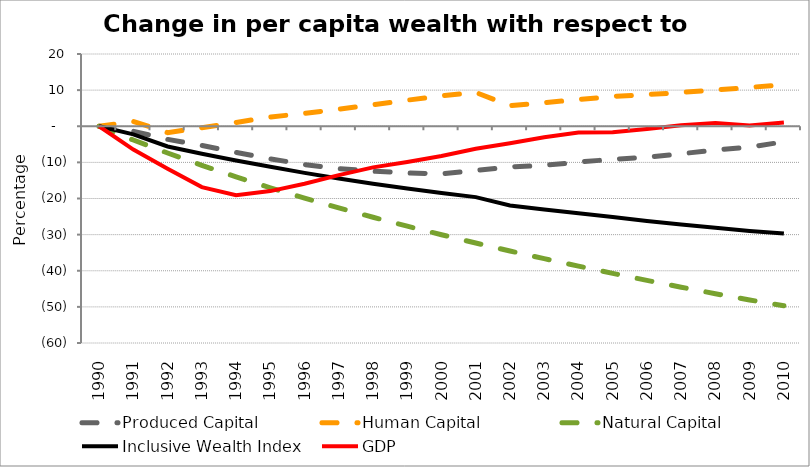
| Category | Produced Capital  | Human Capital | Natural Capital | Inclusive Wealth Index | GDP |
|---|---|---|---|---|---|
| 1990.0 | 0 | 0 | 0 | 0 | 0 |
| 1991.0 | -1.384 | 1.326 | -3.812 | -2.251 | -6.445 |
| 1992.0 | -3.631 | -1.762 | -7.41 | -5.599 | -11.781 |
| 1993.0 | -5.324 | -0.395 | -10.813 | -7.6 | -16.853 |
| 1994.0 | -7.245 | 1.049 | -14.009 | -9.465 | -19.112 |
| 1995.0 | -9.015 | 2.553 | -17.032 | -11.188 | -17.949 |
| 1996.0 | -10.597 | 3.572 | -19.884 | -12.911 | -15.911 |
| 1997.0 | -11.725 | 4.719 | -22.604 | -14.477 | -13.527 |
| 1998.0 | -12.444 | 5.97 | -25.195 | -15.896 | -11.379 |
| 1999.0 | -12.935 | 7.219 | -27.663 | -17.216 | -9.873 |
| 2000.0 | -13.175 | 8.397 | -30.034 | -18.469 | -8.232 |
| 2001.0 | -12.241 | 9.373 | -32.318 | -19.62 | -6.251 |
| 2002.0 | -11.253 | 5.667 | -34.523 | -21.948 | -4.682 |
| 2003.0 | -10.828 | 6.519 | -36.653 | -23.075 | -3.057 |
| 2004.0 | -9.913 | 7.386 | -38.714 | -24.111 | -1.705 |
| 2005.0 | -9.154 | 8.257 | -40.721 | -25.123 | -1.671 |
| 2006.0 | -8.554 | 8.751 | -42.671 | -26.212 | -0.734 |
| 2007.0 | -7.61 | 9.363 | -44.555 | -27.197 | 0.254 |
| 2008.0 | -6.595 | 10.045 | -46.359 | -28.106 | 0.898 |
| 2009.0 | -5.778 | 10.759 | -48.085 | -28.972 | 0.242 |
| 2010.0 | -4.307 | 11.509 | -49.681 | -29.688 | 1.016 |